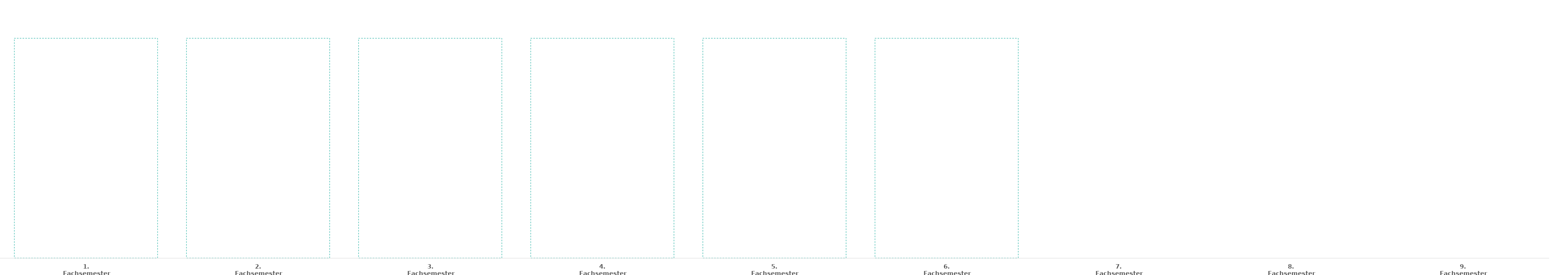
| Category | Modul 1 | Modul 2 | Modul 3 | Modul 4 | Modul 5 | Modul 6 | Modul 7 | Modul 8 | Modul 9 | Seminar | Bachelorarbeit | Soll-ECTS |
|---|---|---|---|---|---|---|---|---|---|---|---|---|
| 1. Fachsemester | 0 | 0 | 0 | 0 | 0 | 0 | 0 | 0 | 0 | 0 | 0 | 30 |
| 2. Fachsemester | 0 | 0 | 0 | 0 | 0 | 0 | 0 | 0 | 0 | 0 | 0 | 30 |
| 3. Fachsemester | 0 | 0 | 0 | 0 | 0 | 0 | 0 | 0 | 0 | 0 | 0 | 30 |
| 4. Fachsemester | 0 | 0 | 0 | 0 | 0 | 0 | 0 | 0 | 0 | 0 | 0 | 30 |
| 5. Fachsemester | 0 | 0 | 0 | 0 | 0 | 0 | 0 | 0 | 0 | 0 | 0 | 30 |
| 6. Fachsemester | 0 | 0 | 0 | 0 | 0 | 0 | 0 | 0 | 0 | 0 | 0 | 30 |
| 7. Fachsemester | 0 | 0 | 0 | 0 | 0 | 0 | 0 | 0 | 0 | 0 | 0 | 0 |
| 8. Fachsemester | 0 | 0 | 0 | 0 | 0 | 0 | 0 | 0 | 0 | 0 | 0 | 0 |
| 9. Fachsemester | 0 | 0 | 0 | 0 | 0 | 0 | 0 | 0 | 0 | 0 | 0 | 0 |